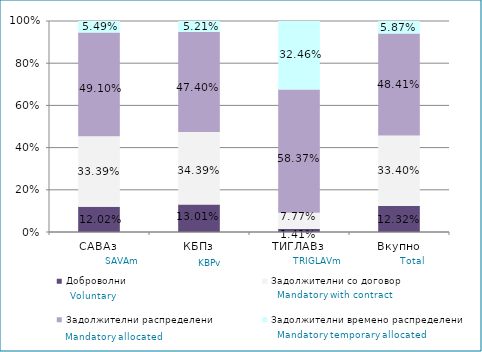
| Category | Доброволни  | Задолжителни со договор  | Задолжителни распределени  | Задолжителни времено распределени  |
|---|---|---|---|---|
| САВАз | 0.12 | 0.334 | 0.491 | 0.055 |
| КБПз | 0.13 | 0.344 | 0.474 | 0.052 |
| ТИГЛАВз | 0.014 | 0.078 | 0.584 | 0.325 |
| Вкупно | 0.123 | 0.334 | 0.484 | 0.059 |